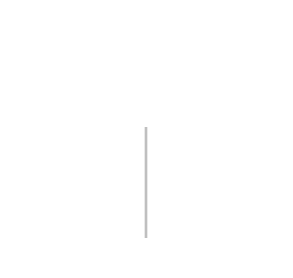
| Category | Positif | Négatif |
|---|---|---|
| 0 | 0 | 0 |
| 1 | 0 | 0 |
| 2 | 0 | 0 |